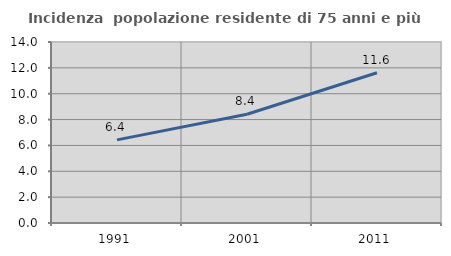
| Category | Incidenza  popolazione residente di 75 anni e più |
|---|---|
| 1991.0 | 6.431 |
| 2001.0 | 8.412 |
| 2011.0 | 11.619 |